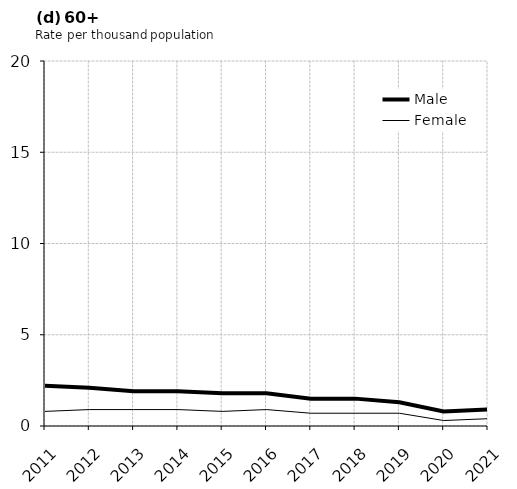
| Category | Male | Female |
|---|---|---|
| 2011.0 | 2.2 | 0.8 |
| 2012.0 | 2.1 | 0.9 |
| 2013.0 | 1.9 | 0.9 |
| 2014.0 | 1.9 | 0.9 |
| 2015.0 | 1.8 | 0.8 |
| 2016.0 | 1.8 | 0.9 |
| 2017.0 | 1.5 | 0.7 |
| 2018.0 | 1.5 | 0.7 |
| 2019.0 | 1.3 | 0.7 |
| 2020.0 | 0.8 | 0.3 |
| 2021.0 | 0.9 | 0.4 |